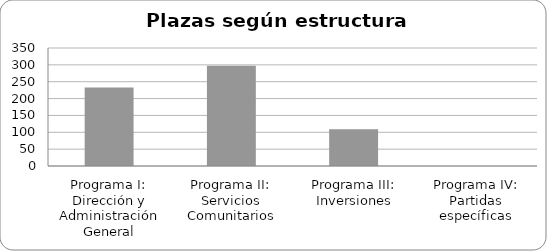
| Category | Series 0 |
|---|---|
| Programa I: Dirección y Administración General | 233 |
| Programa II: Servicios Comunitarios | 297 |
| Programa III: Inversiones | 109 |
| Programa IV: Partidas específicas | 0 |